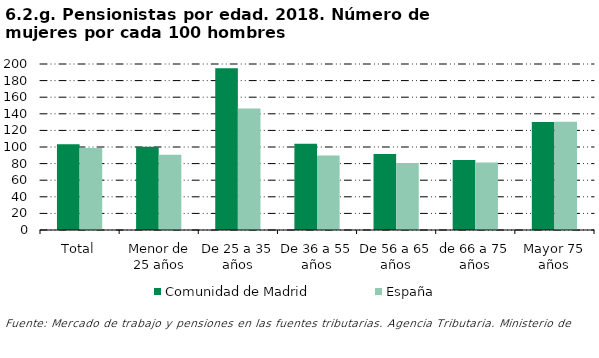
| Category | Comunidad de Madrid | España |
|---|---|---|
| Total | 103.235 | 98.703 |
| Menor de 25 años | 100.209 | 90.53 |
| De 25 a 35 años | 195.029 | 146.418 |
| De 36 a 55 años | 103.82 | 89.856 |
| De 56 a 65 años | 91.522 | 80.717 |
| de 66 a 75 años | 84.27 | 81.446 |
| Mayor 75 años | 130.137 | 130.534 |